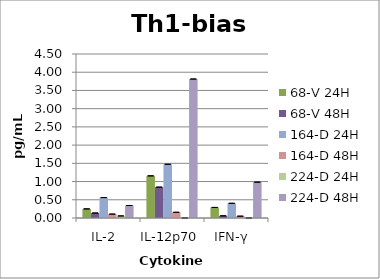
| Category | 68-A 24H | 68-A 48H | 68-V 24H | 68-V 48H | 139-A 24H | 139-A 48H | 164-D 24H | 164-D 48H | 224-D 24H | 224-D 48H |
|---|---|---|---|---|---|---|---|---|---|---|
| IL-2  |  |  | 0.25 | 0.137 |  |  | 0.56 | 0.107 | 0.057 | 0.343 |
| IL-12p70  |  |  | 1.157 | 0.847 |  |  | 1.473 | 0.157 | 0 | 3.813 |
| IFN-γ  |  |  | 0.29 | 0.06 |  |  | 0.403 | 0.05 | 0 | 0.983 |